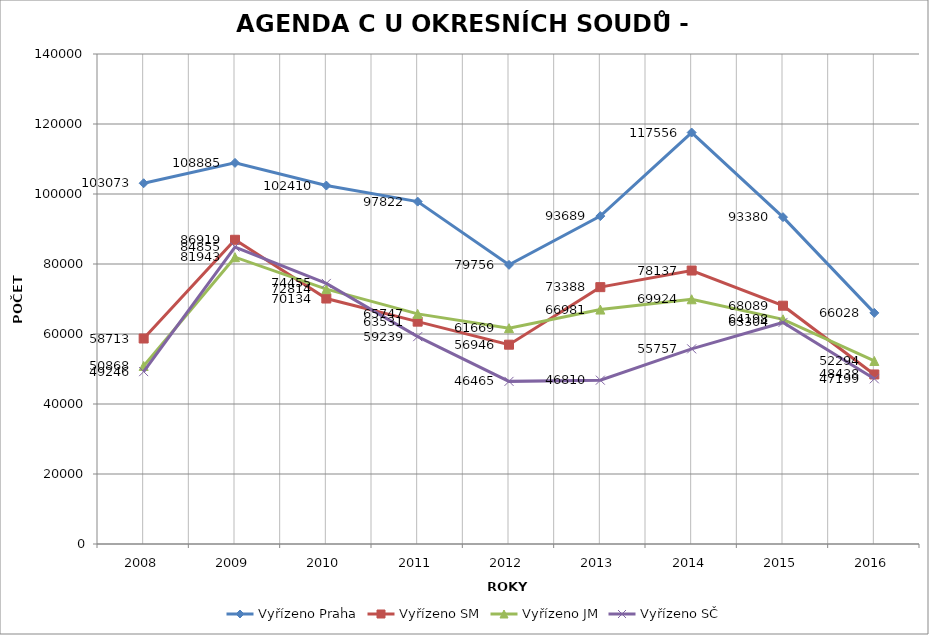
| Category | Vyřízeno Praha | Vyřízeno SM | Vyřízeno JM | Vyřízeno SČ |
|---|---|---|---|---|
| 2008.0 | 103073 | 58713 | 50868 | 49246 |
| 2009.0 | 108885 | 86919 | 81943 | 84855 |
| 2010.0 | 102410 | 70134 | 72814 | 74455 |
| 2011.0 | 97822 | 63531 | 65747 | 59239 |
| 2012.0 | 79756 | 56946 | 61669 | 46465 |
| 2013.0 | 93689 | 73388 | 66981 | 46810 |
| 2014.0 | 117556 | 78137 | 69924 | 55757 |
| 2015.0 | 93380 | 68089 | 64198 | 63304 |
| 2016.0 | 66028 | 48438 | 52294 | 47199 |